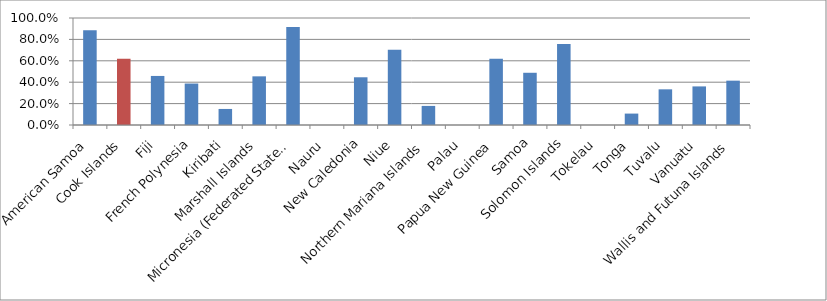
| Category | Proportion |
|---|---|
| American Samoa | 0.886 |
| Cook Islands | 0.618 |
| Fiji | 0.458 |
| French Polynesia | 0.388 |
| Kiribati | 0.15 |
| Marshall Islands | 0.455 |
| Micronesia (Federated States of) | 0.916 |
| Nauru | 0 |
| New Caledonia | 0.446 |
| Niue | 0.704 |
| Northern Mariana Islands | 0.178 |
| Palau | 0 |
| Papua New Guinea | 0.619 |
| Samoa | 0.488 |
| Solomon Islands | 0.756 |
| Tokelau | 0 |
| Tonga | 0.107 |
| Tuvalu | 0.333 |
| Vanuatu | 0.361 |
| Wallis and Futuna Islands | 0.414 |